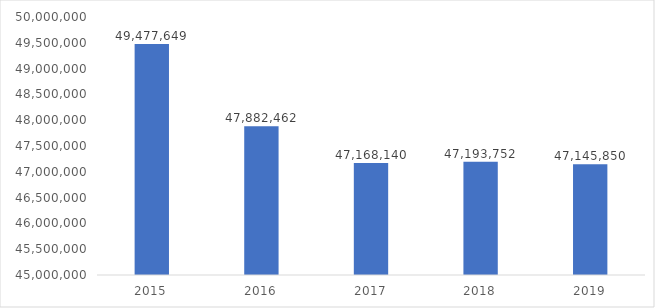
| Category | Series 0 |
|---|---|
| 2015.0 | 49477649 |
| 2016.0 | 47882462 |
| 2017.0 | 47168140 |
| 2018.0 | 47193752 |
| 2019.0 | 47145850 |